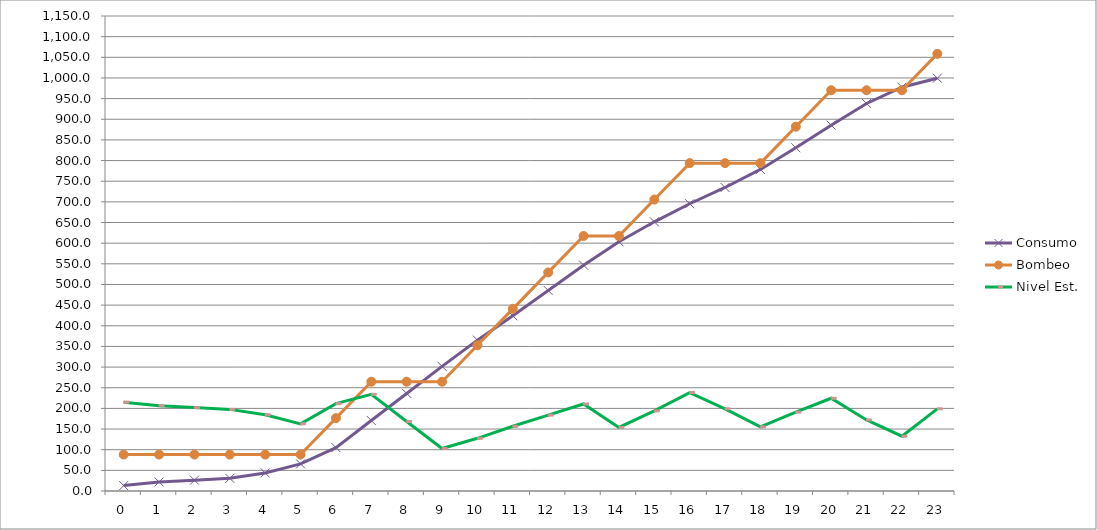
| Category | Consumo | Bombeo | Nivel Est. |
|---|---|---|---|
| 0.0 | 13.122 | 88.2 | 215.078 |
| 1.0 | 21.87 | 88.2 | 206.33 |
| 2.0 | 26.244 | 88.2 | 201.956 |
| 3.0 | 30.618 | 88.2 | 197.582 |
| 4.0 | 43.74 | 88.2 | 184.46 |
| 5.0 | 65.61 | 88.2 | 162.59 |
| 6.0 | 104.976 | 176.4 | 211.424 |
| 7.0 | 170.586 | 264.6 | 234.014 |
| 8.0 | 236.196 | 264.6 | 168.404 |
| 9.0 | 301.806 | 264.6 | 102.794 |
| 10.0 | 365.229 | 352.8 | 127.571 |
| 11.0 | 424.278 | 441 | 156.722 |
| 12.0 | 485.514 | 529.2 | 183.686 |
| 13.0 | 546.75 | 617.4 | 210.65 |
| 14.0 | 603.612 | 617.4 | 153.788 |
| 15.0 | 651.726 | 705.6 | 193.874 |
| 16.0 | 695.466 | 793.8 | 238.334 |
| 17.0 | 734.832 | 793.8 | 198.968 |
| 18.0 | 778.572 | 793.8 | 155.228 |
| 19.0 | 831.06 | 882 | 190.94 |
| 20.0 | 885.735 | 970.2 | 224.465 |
| 21.0 | 938.223 | 970.2 | 171.977 |
| 22.0 | 977.589 | 970.2 | 132.611 |
| 23.0 | 999.459 | 1058.4 | 198.941 |